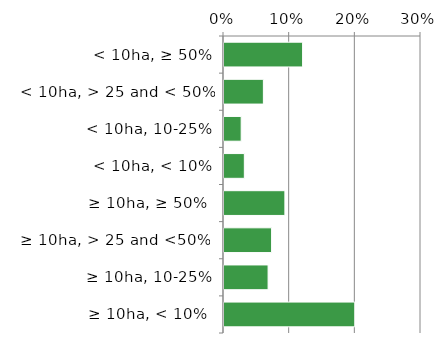
| Category | Native |
|---|---|
|  ≥ 10ha, < 10%  | 0.201 |
|   ≥ 10ha, 10-25% | 0.069 |
|   ≥ 10ha, > 25 and <50%  | 0.074 |
|   ≥ 10ha, ≥ 50%  | 0.094 |
|  < 10ha, < 10% | 0.032 |
|  < 10ha, 10-25% | 0.028 |
|  < 10ha, > 25 and < 50% | 0.061 |
|  < 10ha, ≥ 50% | 0.121 |